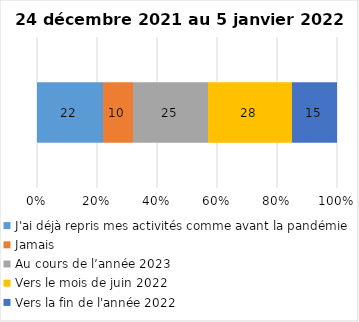
| Category | J'ai déjà repris mes activités comme avant la pandémie | Jamais | Au cours de l’année 2023 | Vers le mois de juin 2022 | Vers la fin de l'année 2022 |
|---|---|---|---|---|---|
| 0 | 22 | 10 | 25 | 28 | 15 |